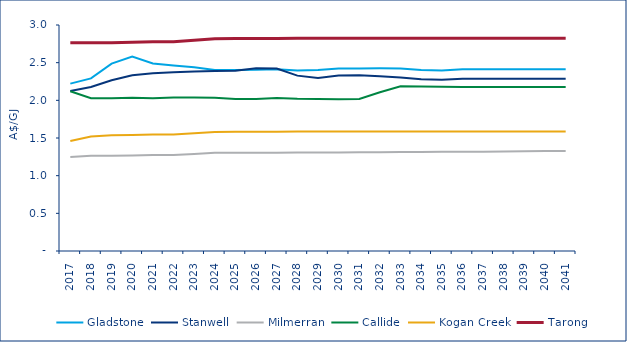
| Category | Gladstone | Stanwell | Milmerran | Callide | Kogan Creek | Tarong |
|---|---|---|---|---|---|---|
| 2017.0 | 2.222 | 2.124 | 1.249 | 2.12 | 1.459 | 2.766 |
| 2018.0 | 2.291 | 2.176 | 1.265 | 2.027 | 1.521 | 2.766 |
| 2019.0 | 2.487 | 2.266 | 1.265 | 2.029 | 1.535 | 2.766 |
| 2020.0 | 2.581 | 2.332 | 1.269 | 2.035 | 1.54 | 2.772 |
| 2021.0 | 2.488 | 2.358 | 1.274 | 2.027 | 1.546 | 2.778 |
| 2022.0 | 2.461 | 2.372 | 1.275 | 2.036 | 1.547 | 2.779 |
| 2023.0 | 2.439 | 2.382 | 1.289 | 2.038 | 1.564 | 2.799 |
| 2024.0 | 2.404 | 2.391 | 1.303 | 2.035 | 1.581 | 2.819 |
| 2025.0 | 2.404 | 2.394 | 1.304 | 2.017 | 1.582 | 2.82 |
| 2026.0 | 2.406 | 2.427 | 1.305 | 2.017 | 1.583 | 2.821 |
| 2027.0 | 2.411 | 2.422 | 1.305 | 2.031 | 1.584 | 2.822 |
| 2028.0 | 2.395 | 2.328 | 1.306 | 2.021 | 1.585 | 2.824 |
| 2029.0 | 2.403 | 2.298 | 1.308 | 2.018 | 1.586 | 2.824 |
| 2030.0 | 2.424 | 2.329 | 1.309 | 2.016 | 1.586 | 2.824 |
| 2031.0 | 2.421 | 2.334 | 1.31 | 2.018 | 1.586 | 2.824 |
| 2032.0 | 2.425 | 2.32 | 1.311 | 2.108 | 1.586 | 2.824 |
| 2033.0 | 2.424 | 2.304 | 1.313 | 2.186 | 1.586 | 2.824 |
| 2034.0 | 2.402 | 2.279 | 1.314 | 2.184 | 1.586 | 2.824 |
| 2035.0 | 2.396 | 2.272 | 1.316 | 2.179 | 1.586 | 2.824 |
| 2036.0 | 2.412 | 2.288 | 1.317 | 2.176 | 1.586 | 2.824 |
| 2037.0 | 2.412 | 2.288 | 1.319 | 2.176 | 1.586 | 2.824 |
| 2038.0 | 2.412 | 2.288 | 1.321 | 2.176 | 1.586 | 2.824 |
| 2039.0 | 2.412 | 2.288 | 1.323 | 2.176 | 1.586 | 2.824 |
| 2040.0 | 2.412 | 2.288 | 1.326 | 2.176 | 1.586 | 2.824 |
| 2041.0 | 2.412 | 2.288 | 1.328 | 2.176 | 1.586 | 2.824 |